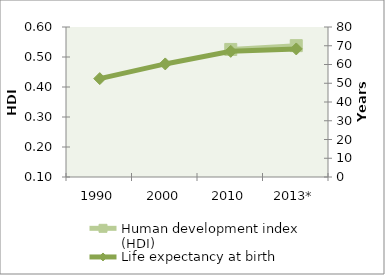
| Category | Human development index (HDI) |
|---|---|
| 1990 | 0 |
| 2000 | 0 |
| 2010 | 0.525 |
| 2013* | 0.538 |